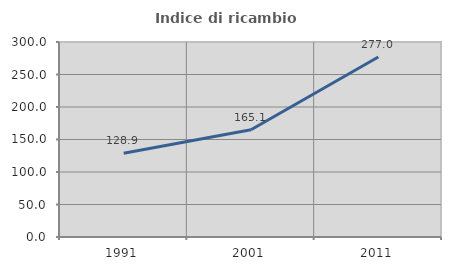
| Category | Indice di ricambio occupazionale  |
|---|---|
| 1991.0 | 128.889 |
| 2001.0 | 165.062 |
| 2011.0 | 276.971 |